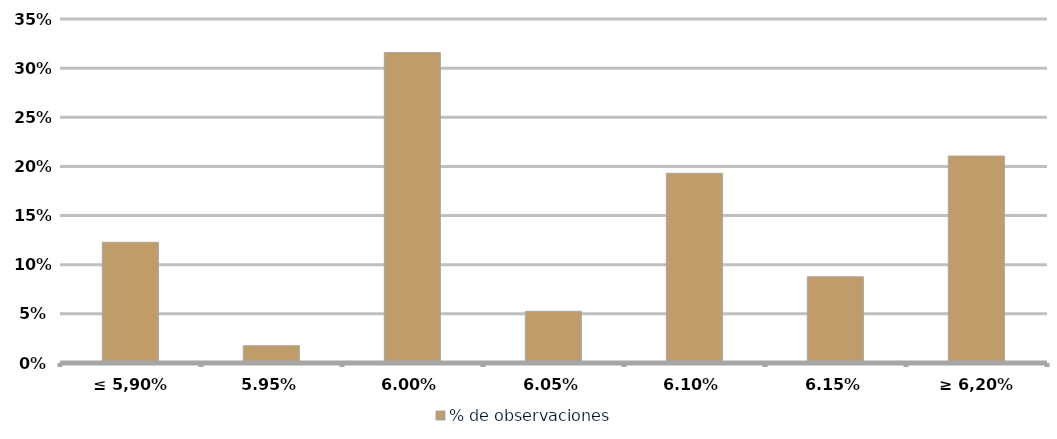
| Category | % de observaciones  |
|---|---|
| ≤ 5,90% | 0.123 |
| 5,95% | 0.018 |
| 6,00% | 0.316 |
| 6,05% | 0.053 |
| 6,10% | 0.193 |
| 6,15% | 0.088 |
| ≥ 6,20% | 0.211 |